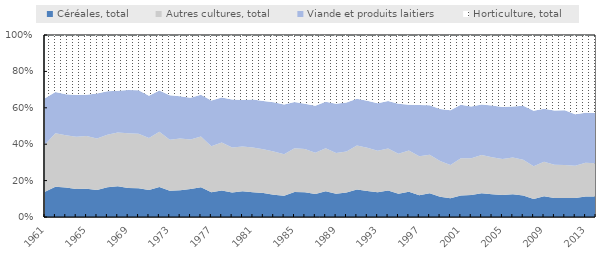
| Category | Céréales, total | Autres cultures, total | Viande et produits laitiers | Horticulture, total |
|---|---|---|---|---|
| 1961.0 | 3034960.784 | 5657135.928 | 5566558.133 | 7584675.303 |
| 1962.0 | 4144258.215 | 7372814.939 | 5650249.094 | 7823772.739 |
| 1963.0 | 4084024.032 | 7284433.626 | 5689488.777 | 8223590.063 |
| 1964.0 | 3899503.555 | 7283754.641 | 5823404.326 | 8363113.118 |
| 1965.0 | 4163618.508 | 7777962.395 | 6060612.002 | 8809885.577 |
| 1966.0 | 3740926.753 | 7098270.793 | 6253012.934 | 8075241.092 |
| 1967.0 | 4392280.999 | 7781435.448 | 6449307.555 | 8335736.987 |
| 1968.0 | 4971633.794 | 8700334.563 | 6736062.228 | 9028061.182 |
| 1969.0 | 4639226.92 | 8749350.144 | 6903943.917 | 8775884.089 |
| 1970.0 | 4602086.213 | 8766641.998 | 7001938.547 | 8865749.671 |
| 1971.0 | 4612673.825 | 8860711.422 | 7186022.49 | 10373258.303 |
| 1972.0 | 5359979.41 | 9921073.298 | 7378587.518 | 9920450.014 |
| 1973.0 | 4450640.146 | 8728300.641 | 7578487.358 | 10243929.45 |
| 1974.0 | 5008002.125 | 9635629.611 | 7843068.809 | 11436157.065 |
| 1975.0 | 5358200.592 | 9547918.582 | 8014050.515 | 12030033.184 |
| 1976.0 | 5942771.225 | 10197046.621 | 8365435.688 | 11958280.518 |
| 1977.0 | 4693963.641 | 8809597.469 | 8714580.228 | 12468133.457 |
| 1978.0 | 5421844.737 | 9819419.602 | 9232905.621 | 12768538.059 |
| 1979.0 | 4995774.91 | 9120480.889 | 9736374.338 | 13085918.319 |
| 1980.0 | 5635335.116 | 9812697.557 | 10185623.628 | 14245084.408 |
| 1981.0 | 5559259.872 | 10080045.664 | 10797547.232 | 14522693.125 |
| 1982.0 | 5687945.983 | 10387291.111 | 11424295.538 | 15621209.01 |
| 1983.0 | 5336751.82 | 10271839.219 | 11778550.689 | 16037051.3 |
| 1984.0 | 5090554.77 | 9957000.722 | 11908358.464 | 16655664.531 |
| 1985.0 | 6757698.902 | 11905561.61 | 12553220.525 | 18149223.538 |
| 1986.0 | 7105938.87 | 12422468.222 | 13003081.965 | 19758034.384 |
| 1987.0 | 6489653.263 | 11619296.143 | 13254369.767 | 19988299.264 |
| 1988.0 | 7667573.872 | 12884929.385 | 13874352.252 | 19922448.628 |
| 1989.0 | 6859462.022 | 12032839.971 | 14589637.719 | 20311419.051 |
| 1990.0 | 8046046.469 | 13431866.622 | 16158953.804 | 22133193.23 |
| 1991.0 | 9571795.016 | 15372743.855 | 16326230.746 | 22308981.307 |
| 1992.0 | 9412845.934 | 15699258.928 | 17037285.804 | 23897119.234 |
| 1993.0 | 9109362.978 | 15309183.197 | 17496760.579 | 25130945.031 |
| 1994.0 | 10205584.361 | 16233771.524 | 18431612.068 | 25458644.508 |
| 1995.0 | 8971824.203 | 15377814.461 | 19245091.444 | 26437892.106 |
| 1996.0 | 11066151.669 | 18165794.536 | 20080695.197 | 30627968.244 |
| 1997.0 | 9178784.047 | 16323135.866 | 21493688.281 | 29451003.267 |
| 1998.0 | 10757349.262 | 17386838.118 | 22408762.001 | 31739456.829 |
| 1999.0 | 9031264.46 | 16001313.768 | 23218380.652 | 33113582.914 |
| 2000.0 | 8323676.64 | 14840525.115 | 24424822.105 | 33533369.682 |
| 2001.0 | 9970310.451 | 17397598.871 | 24884084.565 | 32553962.65 |
| 2002.0 | 11061979.19 | 18428075.517 | 25857451.242 | 35828286.903 |
| 2003.0 | 12659023.427 | 20332678.133 | 26957797.896 | 36957334.288 |
| 2004.0 | 12297953.982 | 19973165.604 | 27963336.187 | 38016835.682 |
| 2005.0 | 12377446.706 | 20115273.838 | 29202999.925 | 40425580.868 |
| 2006.0 | 13323216.306 | 21559548.606 | 29959877.372 | 41978577.491 |
| 2007.0 | 12425456.807 | 20745775.6 | 31220864.14 | 40949602.39 |
| 2008.0 | 10179848.522 | 18437670.882 | 31300896.634 | 42776951.281 |
| 2009.0 | 12582844.54 | 20942259.181 | 32150516.688 | 44859926.15 |
| 2010.0 | 11276584.491 | 19720406.832 | 32295231.05 | 44813844.14 |
| 2011.0 | 11449580.374 | 19926890.208 | 33076383.672 | 45487019.481 |
| 2012.0 | 11254999.559 | 19012260.736 | 30473439.11 | 46825009.676 |
| 2013.0 | 12550785.67 | 20463495.614 | 30514266.717 | 47429056.518 |
| 2014.0 | 12342077.936 | 20267092.175 | 30406841.834 | 47314582.492 |